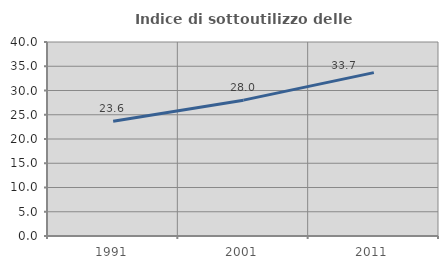
| Category | Indice di sottoutilizzo delle abitazioni  |
|---|---|
| 1991.0 | 23.647 |
| 2001.0 | 28.009 |
| 2011.0 | 33.689 |